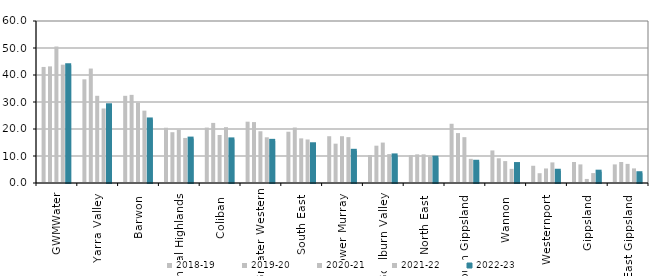
| Category | 2018-19 | 2019-20 | 2020-21 | 2021-22 | 2022-23 |
|---|---|---|---|---|---|
| GWMWater | 42.984 | 43.191 | 50.522 | 43.82 | 43.613 |
| Yarra Valley  | 38.4 | 42.392 | 32.296 | 27.598 | 28.786 |
| Barwon  | 32.292 | 32.642 | 29.745 | 26.799 | 23.531 |
| Central Highlands  | 20.469 | 18.809 | 19.722 | 16.688 | 16.447 |
| Coliban  | 20.528 | 22.255 | 17.78 | 20.683 | 16.15 |
| Greater Western | 22.709 | 22.564 | 19.164 | 16.932 | 15.614 |
| South East  | 18.99 | 20.549 | 16.53 | 16.119 | 14.346 |
| Lower Murray  | 17.325 | 14.565 | 17.327 | 16.981 | 11.925 |
| Goulburn Valley  | 10.347 | 13.822 | 14.971 | 10.706 | 10.216 |
| North East  | 10.294 | 10.613 | 10.615 | 9.726 | 9.38 |
| South Gippsland  | 21.937 | 18.488 | 16.975 | 8.952 | 7.865 |
| Wannon  | 12.065 | 9.154 | 8.11 | 5.242 | 7.016 |
| Westernport  | 6.383 | 3.629 | 5.383 | 7.632 | 4.534 |
| Gippsland  | 7.775 | 6.889 | 1.501 | 3.67 | 4.192 |
| East Gippsland  | 6.892 | 7.787 | 7.075 | 5.405 | 3.623 |